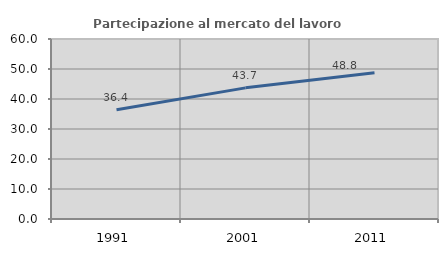
| Category | Partecipazione al mercato del lavoro  femminile |
|---|---|
| 1991.0 | 36.441 |
| 2001.0 | 43.713 |
| 2011.0 | 48.771 |